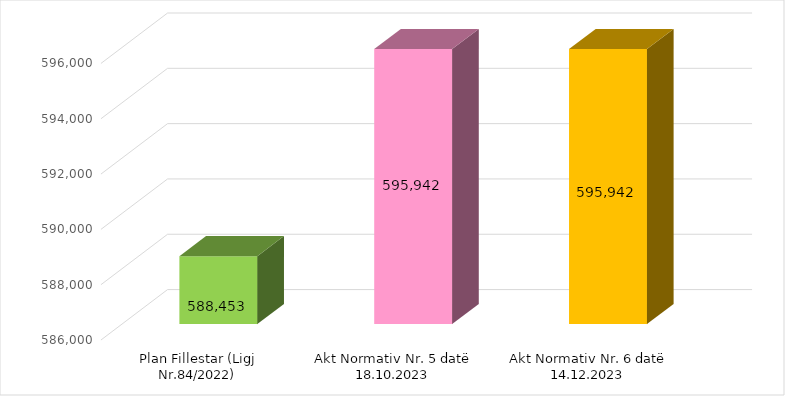
| Category | Të ardhurat tatimore |
|---|---|
| Plan Fillestar (Ligj Nr.84/2022) | 588453 |
| Akt Normativ Nr. 5 datë 18.10.2023 | 595942 |
| Akt Normativ Nr. 6 datë 14.12.2023 | 595942 |